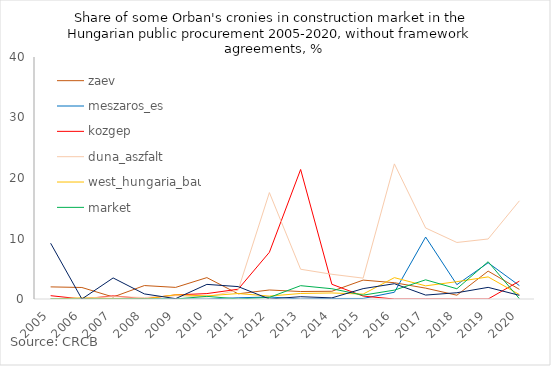
| Category | zaev | meszaros_es | kozgep | duna_aszfalt | west_hungaria_bau | market | magyar_epito |
|---|---|---|---|---|---|---|---|
| 2005.0 | 2.003 | 0 | 0.548 | 0.041 | 0 | 0 | 9.215 |
| 2006.0 | 1.902 | 0 | 0 | 0.152 | 0.176 | 0 | 0 |
| 2007.0 | 0.329 | 0 | 0.518 | 0.381 | 0.05 | 0 | 3.48 |
| 2008.0 | 2.221 | 0 | 0.052 | 0.245 | 0 | 0.023 | 0.841 |
| 2009.0 | 1.916 | 0 | 0.672 | 0.547 | 0.705 | 0.006 | 0.06 |
| 2010.0 | 3.533 | 0 | 0.895 | 0.326 | 0.514 | 0.436 | 2.417 |
| 2011.0 | 0.86 | 0.199 | 1.615 | 1.466 | 0.906 | 0.01 | 2.049 |
| 2012.0 | 1.489 | 0.333 | 7.721 | 17.59 | 0.48 | 0.259 | 0 |
| 2013.0 | 1.237 | 0.001 | 21.409 | 4.917 | 0.912 | 2.204 | 0.381 |
| 2014.0 | 1.277 | 0.085 | 2.432 | 4.087 | 0.999 | 1.696 | 0.185 |
| 2015.0 | 3.123 | 0.09 | 0.481 | 3.448 | 0.809 | 0.638 | 1.714 |
| 2016.0 | 2.689 | 1.114 | 0 | 22.33 | 3.529 | 1.467 | 2.527 |
| 2017.0 | 1.794 | 10.242 | 0 | 11.738 | 2.172 | 3.171 | 0.651 |
| 2018.0 | 0.626 | 2.367 | 0 | 9.343 | 2.864 | 1.692 | 1.035 |
| 2019.0 | 4.609 | 5.989 | 0 | 9.922 | 3.653 | 6.159 | 1.923 |
| 2020.0 | 1.596 | 2.213 | 2.954 | 16.224 | 0.737 | 0.049 | 0.606 |